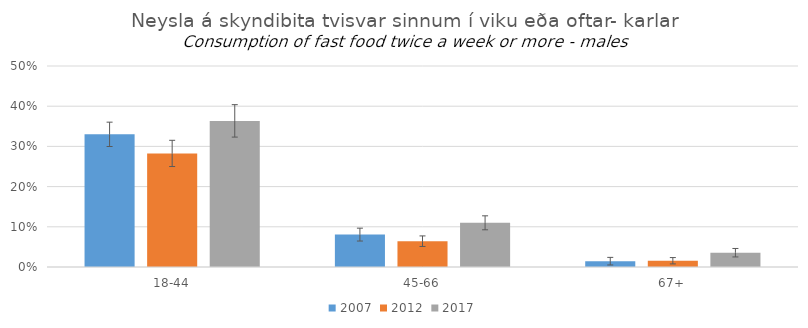
| Category | 2007 | 2012 | 2017 |
|---|---|---|---|
| 18-44 | 0.33 | 0.283 | 0.363 |
| 45-66 | 0.081 | 0.064 | 0.11 |
| 67+ | 0.015 | 0.016 | 0.036 |